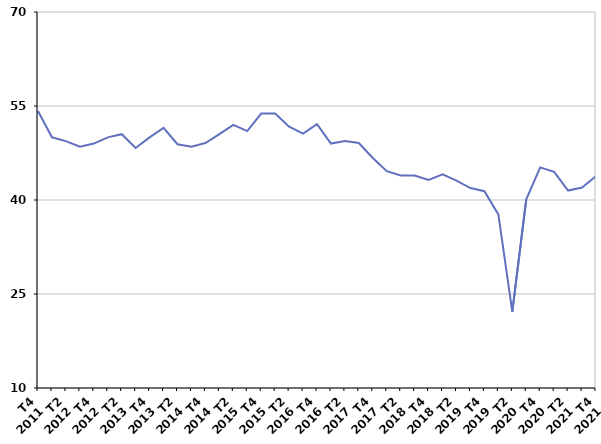
| Category | Autre cas |
|---|---|
| T4
2011 | 54.2 |
| T1
2012 | 50 |
| T2
2012 | 49.4 |
| T3
2012 | 48.5 |
| T4
2012 | 49 |
| T1
2013 | 50 |
| T2
2013 | 50.5 |
| T3
2013 | 48.3 |
| T4
2013 | 50 |
| T1
2014 | 51.5 |
| T2
2014 | 48.9 |
| T3
2014 | 48.5 |
| T4
2014 | 49.1 |
| T1
2015 | 50.5 |
| T2
2015 | 52 |
| T3
2015 | 51 |
| T4
2015 | 53.8 |
| T1
2016 | 53.8 |
| T2
2016 | 51.7 |
| T3
2016 | 50.6 |
| T4
2016 | 52.1 |
| T1
2017 | 49 |
| T2
2017 | 49.4 |
| T3
2017 | 49.1 |
| T4
2017 | 46.7 |
| T1
2018 | 44.6 |
| T2
2018 | 43.9 |
| T3
2018 | 43.9 |
| T4
2018 | 43.2 |
| T1
2019 | 44.1 |
| T2
2019 | 43.1 |
| T3
2019 | 41.9 |
| T4
2019 | 41.4 |
| T1
2020 | 37.7 |
| T2
2020 | 22.2 |
| T3
2020 | 40.1 |
| T4
2020 | 45.2 |
| T1
2021 | 44.5 |
| T2
2021 | 41.5 |
| T3
2021 | 42 |
| T4
2021 | 43.8 |